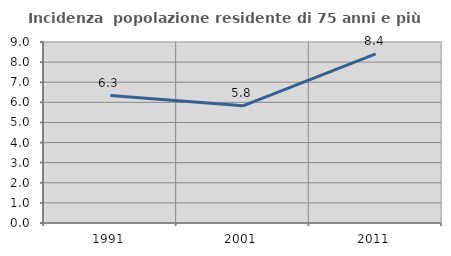
| Category | Incidenza  popolazione residente di 75 anni e più |
|---|---|
| 1991.0 | 6.34 |
| 2001.0 | 5.824 |
| 2011.0 | 8.408 |